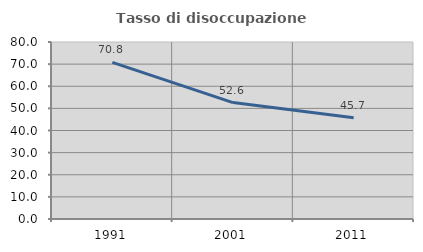
| Category | Tasso di disoccupazione giovanile  |
|---|---|
| 1991.0 | 70.82 |
| 2001.0 | 52.617 |
| 2011.0 | 45.734 |